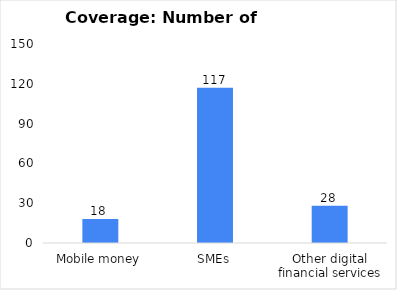
| Category | Coverage: Number of jurisdictions |
|---|---|
| Mobile money | 18 |
| SMEs | 117 |
| Other digital financial services | 28 |